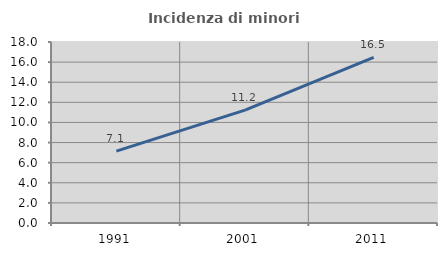
| Category | Incidenza di minori stranieri |
|---|---|
| 1991.0 | 7.143 |
| 2001.0 | 11.224 |
| 2011.0 | 16.461 |